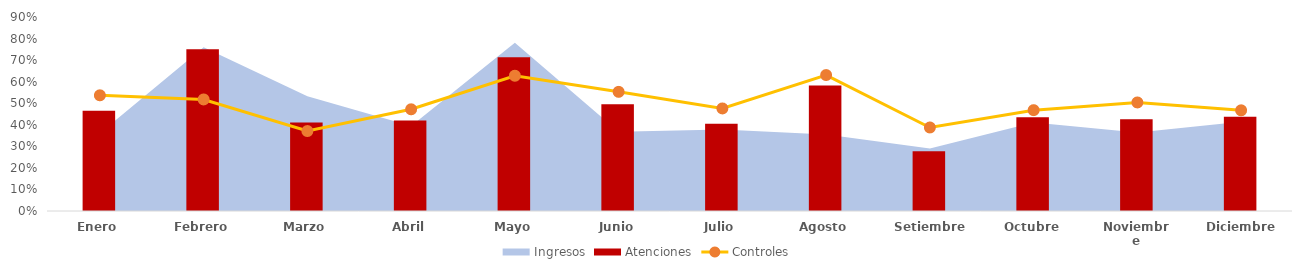
| Category | Atenciones |
|---|---|
| Enero | 0.465 |
| Febrero | 0.75 |
| Marzo | 0.41 |
| Abril | 0.419 |
| Mayo | 0.713 |
| Junio | 0.495 |
| Julio | 0.404 |
| Agosto | 0.583 |
| Setiembre | 0.277 |
| Octubre | 0.434 |
| Noviembre | 0.425 |
| Diciembre | 0.437 |